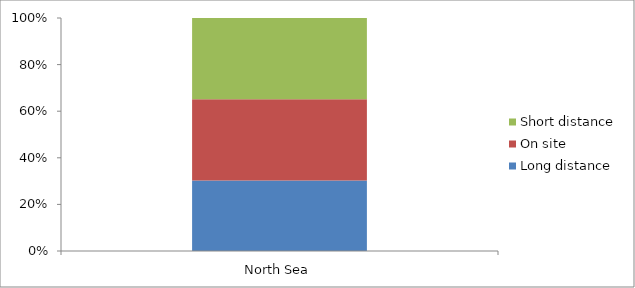
| Category | Long distance | On site | Short distance |
|---|---|---|---|
| North Sea | 166151 | 191034.75 | 191034.75 |